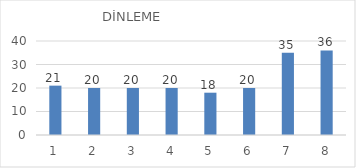
| Category | Series 0 |
|---|---|
| 0 | 21 |
| 1 | 20 |
| 2 | 20 |
| 3 | 20 |
| 4 | 18 |
| 5 | 20 |
| 6 | 35 |
| 7 | 36 |